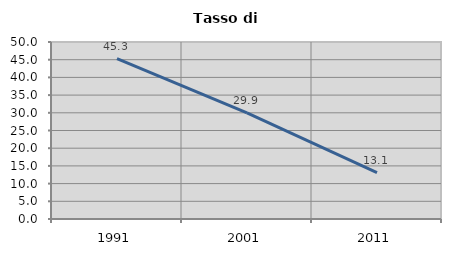
| Category | Tasso di disoccupazione   |
|---|---|
| 1991.0 | 45.32 |
| 2001.0 | 29.949 |
| 2011.0 | 13.072 |